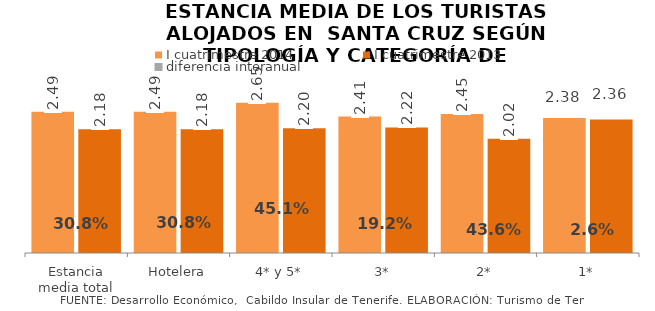
| Category | I cuatrimestre 2014 | I cuatrimestre 2013 |
|---|---|---|
| Estancia media total | 2.491 | 2.183 |
| Hotelera | 2.491 | 2.183 |
| 4* y 5* | 2.652 | 2.201 |
| 3* | 2.408 | 2.216 |
| 2* | 2.453 | 2.017 |
| 1* | 2.383 | 2.357 |